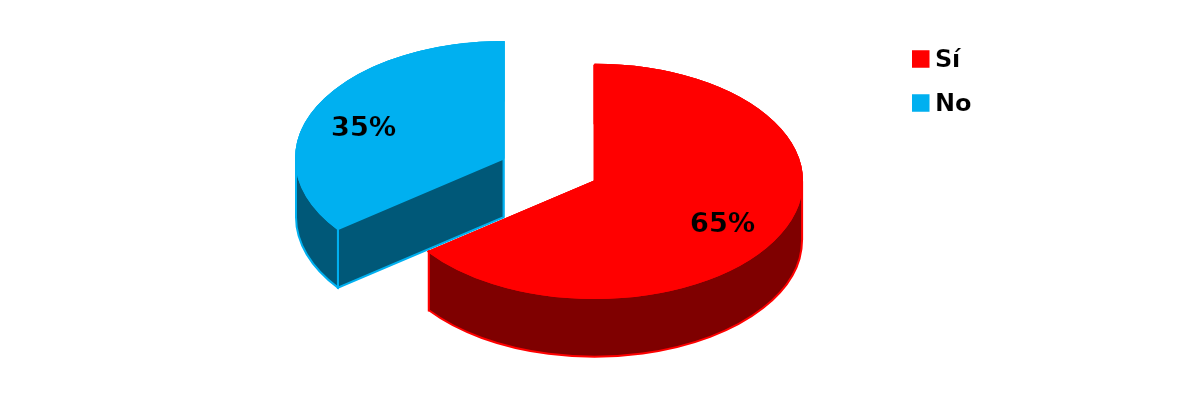
| Category | Series 0 |
|---|---|
| Sí | 11 |
| No | 6 |